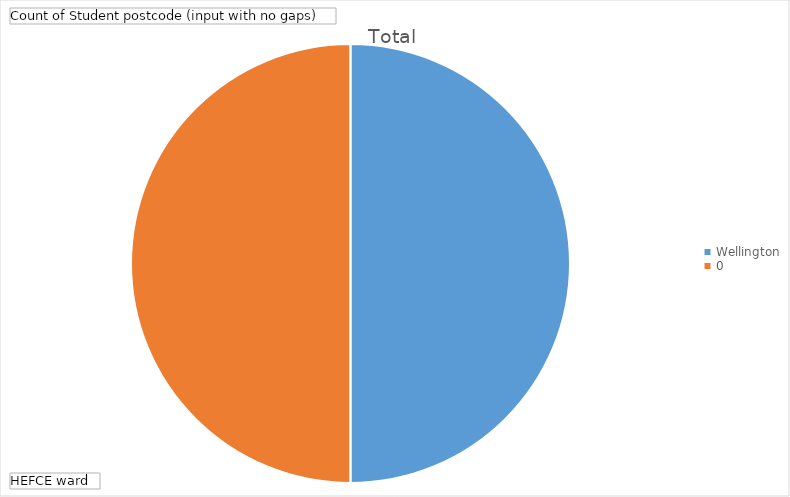
| Category | Total |
|---|---|
| Wellington | 1 |
| #N/A | 1 |